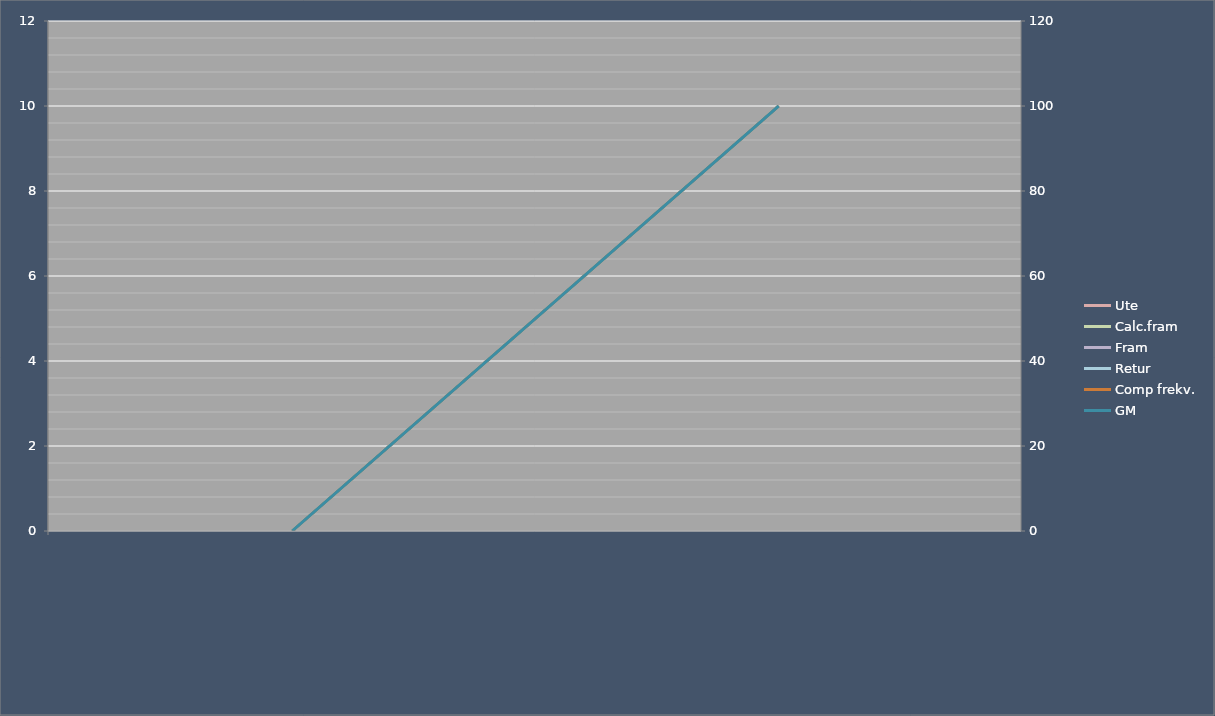
| Category | Ute | Calc.fram | Fram | Retur | Comp frekv. |
|---|---|---|---|---|---|
|  | 0 | 0 | 0 | 0 | 0 |
|  | 10 | 10 | 10 | 10 | 10 |